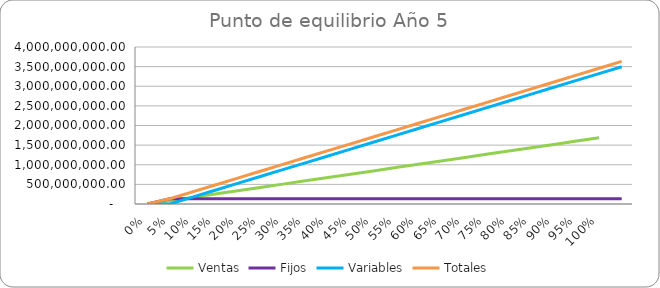
| Category | Ventas | Fijos | Variables | Totales |
|---|---|---|---|---|
| 0.0 | 0 | 0 | 0 | 0 |
| 0.05 | 84341250 | 134294871.942 | 0 | 134294871.942 |
| 0.1 | 168682500 | 134294871.942 | 174900299.781 | 309195171.723 |
| 0.15 | 253023750 | 134294871.942 | 349800599.562 | 484095471.504 |
| 0.2 | 337365000 | 134294871.942 | 524700899.343 | 658995771.285 |
| 0.25 | 421706250 | 134294871.942 | 699601199.125 | 833896071.066 |
| 0.3 | 506047500 | 134294871.942 | 874501498.906 | 1008796370.847 |
| 0.35 | 590388750 | 134294871.942 | 1049401798.687 | 1183696670.628 |
| 0.4 | 674730000 | 134294871.942 | 1224302098.468 | 1358596970.409 |
| 0.45 | 759071250 | 134294871.942 | 1399202398.249 | 1533497270.191 |
| 0.5 | 843412500 | 134294871.942 | 1574102698.03 | 1708397569.972 |
| 0.55 | 927753750 | 134294871.942 | 1749002997.811 | 1883297869.753 |
| 0.6 | 1012095000 | 134294871.942 | 1923903297.592 | 2058198169.534 |
| 0.65 | 1096436250 | 134294871.942 | 2098803597.374 | 2233098469.315 |
| 0.7 | 1180777500 | 134294871.942 | 2273703897.155 | 2407998769.096 |
| 0.75 | 1265118750 | 134294871.942 | 2448604196.936 | 2582899068.877 |
| 0.8 | 1349460000 | 134294871.942 | 2623504496.717 | 2757799368.658 |
| 0.85 | 1433801250 | 134294871.942 | 2798404796.498 | 2932699668.44 |
| 0.9 | 1518142500 | 134294871.942 | 2973305096.279 | 3107599968.221 |
| 0.95 | 1602483750 | 134294871.942 | 3148205396.06 | 3282500268.002 |
| 1.0 | 1686825000 | 134294871.942 | 3323105695.841 | 3457400567.783 |